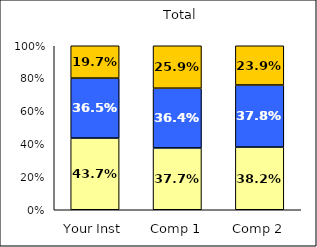
| Category | Low Social Self-Concept | Average Social Self-Concept | High Social Self-Concept |
|---|---|---|---|
| Your Inst | 0.437 | 0.365 | 0.197 |
| Comp 1 | 0.377 | 0.364 | 0.259 |
| Comp 2 | 0.382 | 0.378 | 0.239 |